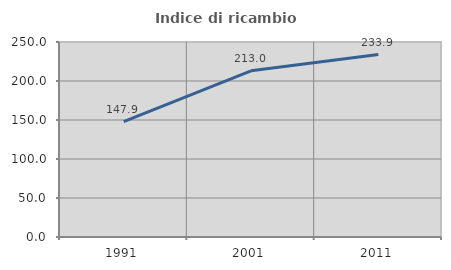
| Category | Indice di ricambio occupazionale  |
|---|---|
| 1991.0 | 147.901 |
| 2001.0 | 213.008 |
| 2011.0 | 233.858 |